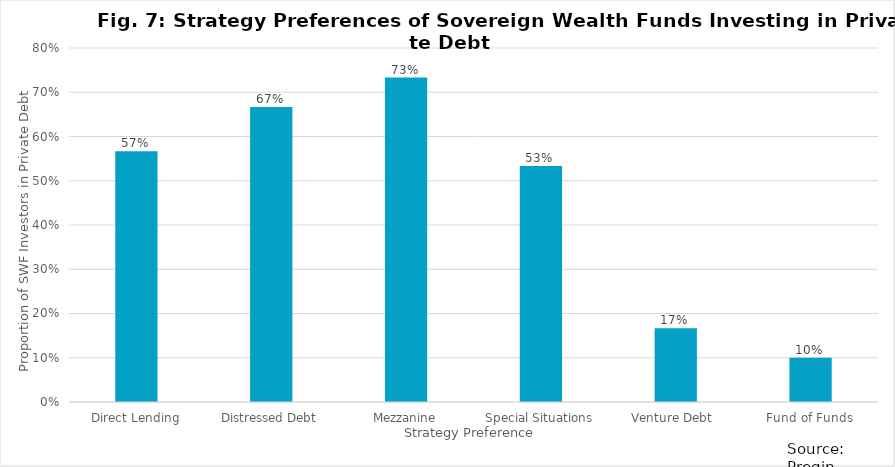
| Category | Series 0 |
|---|---|
| Direct Lending | 0.567 |
| Distressed Debt | 0.667 |
| Mezzanine | 0.733 |
| Special Situations | 0.533 |
| Venture Debt  | 0.167 |
| Fund of Funds | 0.1 |